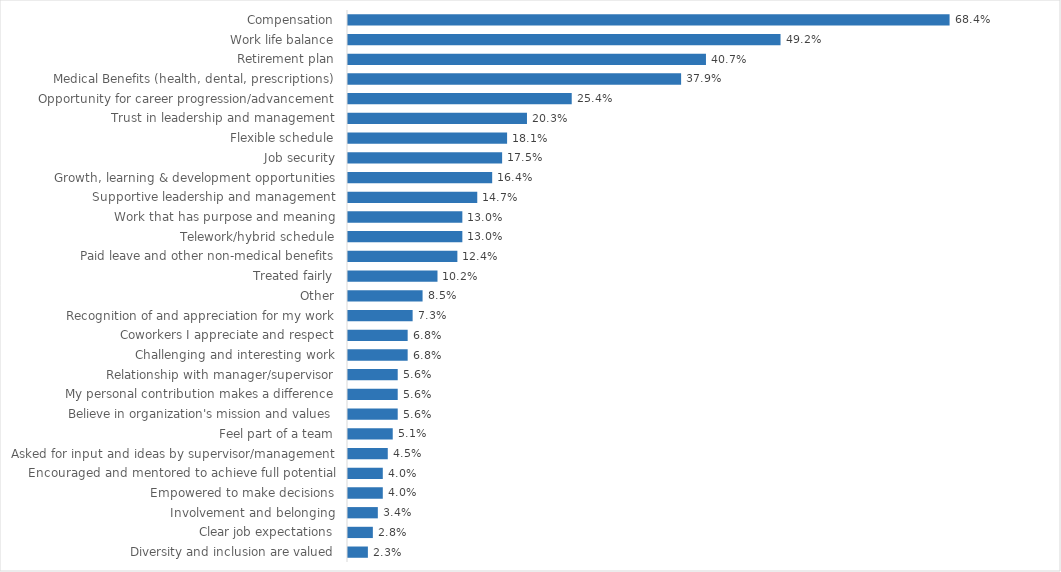
| Category | Public Safety |
|---|---|
| Compensation | 0.684 |
| Work life balance | 0.492 |
| Retirement plan | 0.407 |
| Medical Benefits (health, dental, prescriptions) | 0.379 |
| Opportunity for career progression/advancement | 0.254 |
| Trust in leadership and management | 0.203 |
| Flexible schedule | 0.181 |
| Job security | 0.175 |
| Growth, learning & development opportunities | 0.164 |
| Supportive leadership and management | 0.147 |
| Work that has purpose and meaning | 0.13 |
| Telework/hybrid schedule | 0.13 |
| Paid leave and other non-medical benefits | 0.124 |
| Treated fairly | 0.102 |
| Other | 0.085 |
| Recognition of and appreciation for my work | 0.073 |
| Coworkers I appreciate and respect | 0.068 |
| Challenging and interesting work | 0.068 |
| Relationship with manager/supervisor | 0.056 |
| My personal contribution makes a difference | 0.056 |
| Believe in organization's mission and values | 0.056 |
| Feel part of a team | 0.051 |
| Asked for input and ideas by supervisor/management | 0.045 |
| Encouraged and mentored to achieve full potential | 0.04 |
| Empowered to make decisions | 0.04 |
| Involvement and belonging | 0.034 |
| Clear job expectations | 0.028 |
| Diversity and inclusion are valued | 0.023 |